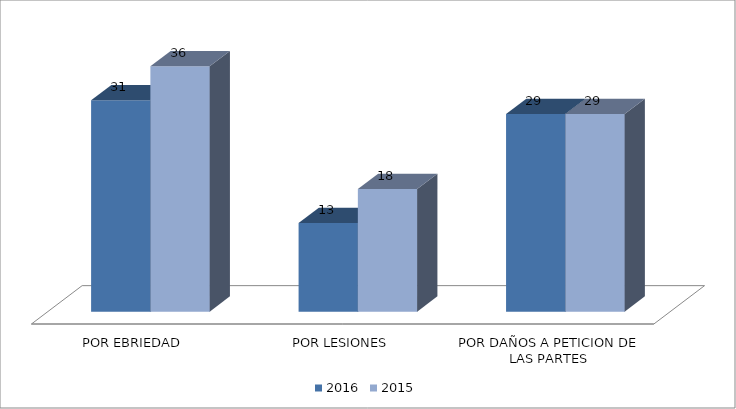
| Category | 2016 | 2015 |
|---|---|---|
| POR EBRIEDAD | 31 | 36 |
| POR LESIONES | 13 | 18 |
| POR DAÑOS A PETICION DE LAS PARTES | 29 | 29 |